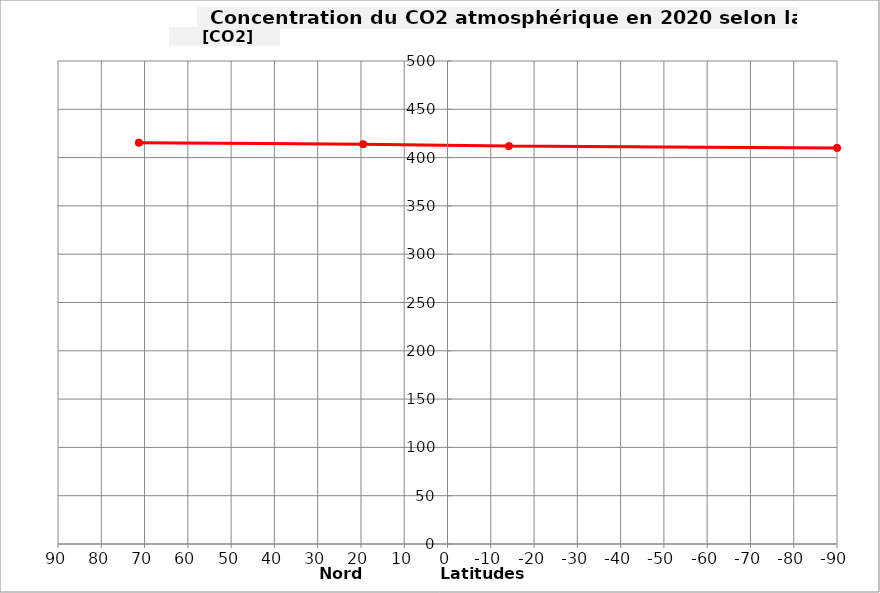
| Category | Series 0 |
|---|---|
| 71.3 | 415.4 |
| 19.5 | 413.9 |
| -14.2 | 411.9 |
| -90.0 | 410 |